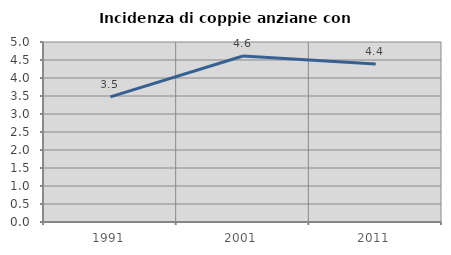
| Category | Incidenza di coppie anziane con figli |
|---|---|
| 1991.0 | 3.476 |
| 2001.0 | 4.61 |
| 2011.0 | 4.387 |